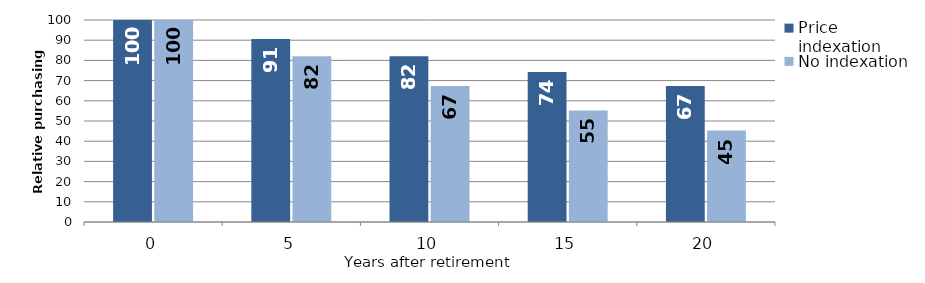
| Category | Price indexation | No indexation |
|---|---|---|
| 0.0 | 100 | 100 |
| 5.0 | 90.573 | 82.035 |
| 10.0 | 82.035 | 67.297 |
| 15.0 | 74.301 | 55.207 |
| 20.0 | 67.297 | 45.289 |